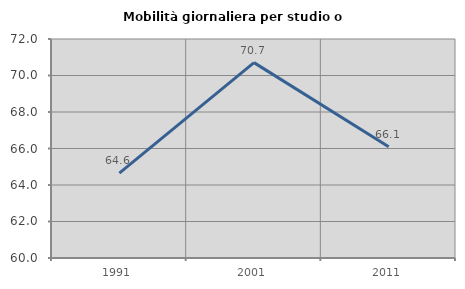
| Category | Mobilità giornaliera per studio o lavoro |
|---|---|
| 1991.0 | 64.648 |
| 2001.0 | 70.706 |
| 2011.0 | 66.094 |